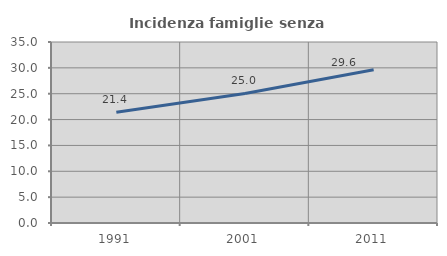
| Category | Incidenza famiglie senza nuclei |
|---|---|
| 1991.0 | 21.429 |
| 2001.0 | 25.043 |
| 2011.0 | 29.636 |